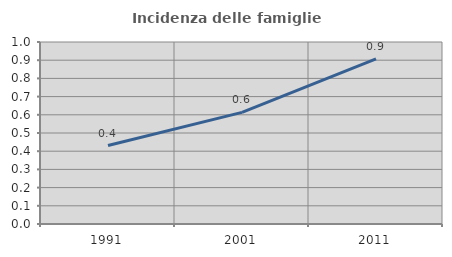
| Category | Incidenza delle famiglie numerose |
|---|---|
| 1991.0 | 0.431 |
| 2001.0 | 0.613 |
| 2011.0 | 0.907 |